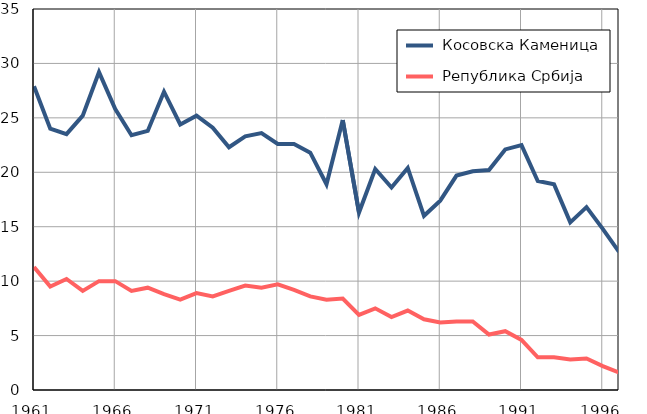
| Category |  Косовска Каменица |  Република Србија |
|---|---|---|
| 1961.0 | 27.9 | 11.3 |
| 1962.0 | 24 | 9.5 |
| 1963.0 | 23.5 | 10.2 |
| 1964.0 | 25.2 | 9.1 |
| 1965.0 | 29.2 | 10 |
| 1966.0 | 25.8 | 10 |
| 1967.0 | 23.4 | 9.1 |
| 1968.0 | 23.8 | 9.4 |
| 1969.0 | 27.4 | 8.8 |
| 1970.0 | 24.4 | 8.3 |
| 1971.0 | 25.2 | 8.9 |
| 1972.0 | 24.1 | 8.6 |
| 1973.0 | 22.3 | 9.1 |
| 1974.0 | 23.3 | 9.6 |
| 1975.0 | 23.6 | 9.4 |
| 1976.0 | 22.6 | 9.7 |
| 1977.0 | 22.6 | 9.2 |
| 1978.0 | 21.8 | 8.6 |
| 1979.0 | 18.9 | 8.3 |
| 1980.0 | 24.8 | 8.4 |
| 1981.0 | 16.3 | 6.9 |
| 1982.0 | 20.3 | 7.5 |
| 1983.0 | 18.6 | 6.7 |
| 1984.0 | 20.4 | 7.3 |
| 1985.0 | 16 | 6.5 |
| 1986.0 | 17.4 | 6.2 |
| 1987.0 | 19.7 | 6.3 |
| 1988.0 | 20.1 | 6.3 |
| 1989.0 | 20.2 | 5.1 |
| 1990.0 | 22.1 | 5.4 |
| 1991.0 | 22.5 | 4.6 |
| 1992.0 | 19.2 | 3 |
| 1993.0 | 18.9 | 3 |
| 1994.0 | 15.4 | 2.8 |
| 1995.0 | 16.8 | 2.9 |
| 1996.0 | 14.8 | 2.2 |
| 1997.0 | 12.7 | 1.6 |